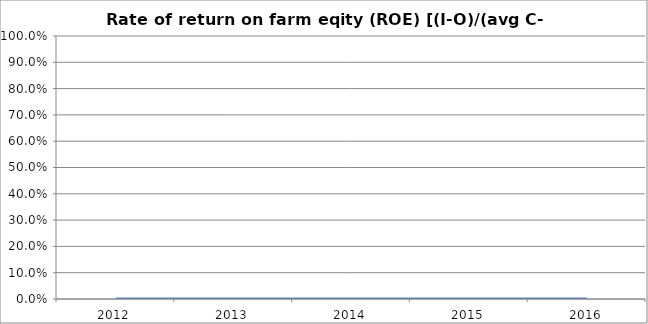
| Category | Rate of return on farm equity (ROE) [(I-O)/(average C-average D)] |
|---|---|
| 2012.0 | 0 |
| 2013.0 | 0 |
| 2014.0 | 0 |
| 2015.0 | 0 |
| 2016.0 | 0 |